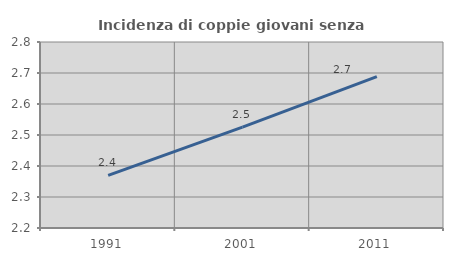
| Category | Incidenza di coppie giovani senza figli |
|---|---|
| 1991.0 | 2.37 |
| 2001.0 | 2.525 |
| 2011.0 | 2.688 |